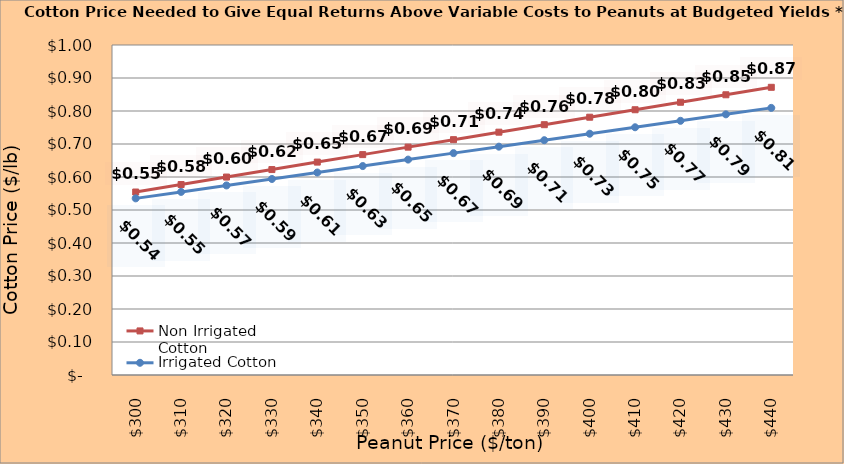
| Category | Non Irrigated Cotton | Irrigated Cotton |
|---|---|---|
| 299.8936170212766 | 0.554 | 0.535 |
| 309.8936170212766 | 0.577 | 0.555 |
| 319.8936170212766 | 0.6 | 0.574 |
| 329.8936170212766 | 0.622 | 0.594 |
| 339.8936170212766 | 0.645 | 0.614 |
| 349.8936170212766 | 0.668 | 0.633 |
| 359.8936170212766 | 0.69 | 0.653 |
| 369.8936170212766 | 0.713 | 0.672 |
| 379.8936170212766 | 0.736 | 0.692 |
| 389.8936170212766 | 0.758 | 0.712 |
| 399.8936170212766 | 0.781 | 0.731 |
| 409.8936170212766 | 0.804 | 0.751 |
| 419.8936170212766 | 0.826 | 0.77 |
| 429.8936170212766 | 0.849 | 0.79 |
| 439.8936170212766 | 0.872 | 0.809 |